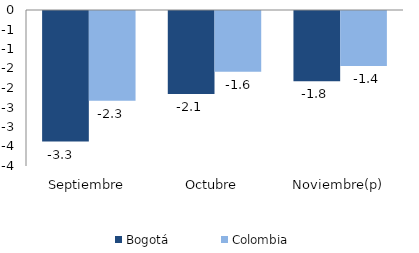
| Category | Bogotá | Colombia |
|---|---|---|
| Septiembre | -3.349 | -2.299 |
| Octubre | -2.129 | -1.557 |
| Noviembre(p) | -1.8 | -1.408 |